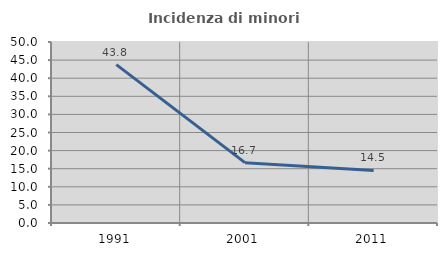
| Category | Incidenza di minori stranieri |
|---|---|
| 1991.0 | 43.75 |
| 2001.0 | 16.667 |
| 2011.0 | 14.504 |